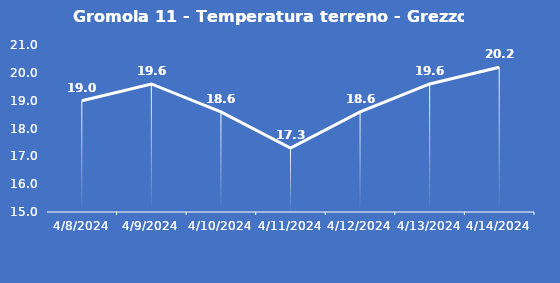
| Category | Gromola 11 - Temperatura terreno - Grezzo (°C) |
|---|---|
| 4/8/24 | 19 |
| 4/9/24 | 19.6 |
| 4/10/24 | 18.6 |
| 4/11/24 | 17.3 |
| 4/12/24 | 18.6 |
| 4/13/24 | 19.6 |
| 4/14/24 | 20.2 |